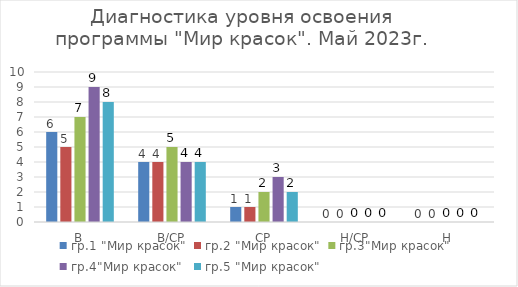
| Category | гр.1 "Мир красок" | гр.2 "Мир красок" | гр.3"Мир красок" | гр.4"Мир красок" | гр.5 "Мир красок" |
|---|---|---|---|---|---|
| В | 6 | 5 | 7 | 9 | 8 |
| В/СР | 4 | 4 | 5 | 4 | 4 |
| СР | 1 | 1 | 2 | 3 | 2 |
| Н/СР | 0 | 0 | 0 | 0 | 0 |
| Н | 0 | 0 | 0 | 0 | 0 |